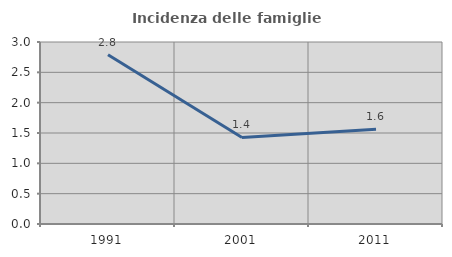
| Category | Incidenza delle famiglie numerose |
|---|---|
| 1991.0 | 2.79 |
| 2001.0 | 1.426 |
| 2011.0 | 1.56 |